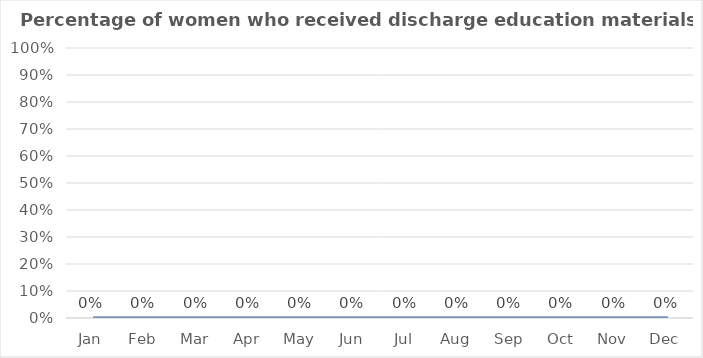
| Category | Percentage of women who received discharge education materials |
|---|---|
| Jan | 0 |
| Feb | 0 |
| Mar | 0 |
| Apr | 0 |
| May | 0 |
| Jun | 0 |
| Jul | 0 |
| Aug | 0 |
| Sep | 0 |
| Oct | 0 |
| Nov | 0 |
| Dec | 0 |